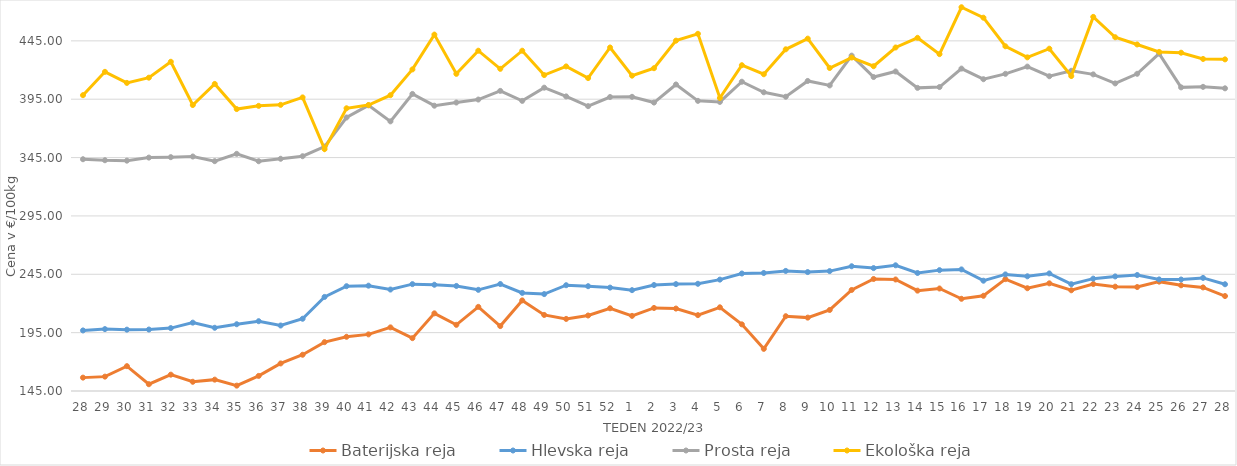
| Category | Baterijska reja | Hlevska reja | Prosta reja | Ekološka reja |
|---|---|---|---|---|
| 28.0 | 156.46 | 196.88 | 343.56 | 398.45 |
| 29.0 | 157.31 | 198.03 | 342.71 | 418.45 |
| 30.0 | 166.29 | 197.55 | 342.35 | 408.97 |
| 31.0 | 150.81 | 197.66 | 344.97 | 413.45 |
| 32.0 | 158.99 | 198.9 | 345.35 | 427.07 |
| 33.0 | 152.91 | 203.57 | 345.9 | 390 |
| 34.0 | 154.73 | 199.17 | 341.92 | 408.1 |
| 35.0 | 149.6 | 202.21 | 348.2 | 386.55 |
| 36.0 | 157.93 | 204.81 | 341.85 | 389.31 |
| 37.0 | 168.61 | 201.11 | 343.97 | 390.17 |
| 38.0 | 176.07 | 206.91 | 346.16 | 396.55 |
| 39.0 | 186.86 | 225.6 | 354.41 | 352.24 |
| 40.0 | 191.45 | 234.79 | 379.35 | 387.24 |
| 41.0 | 193.52 | 235.24 | 389.75 | 390 |
| 42.0 | 199.51 | 231.92 | 376.02 | 398.45 |
| 43.0 | 190.28 | 236.56 | 399.51 | 420.52 |
| 44.0 | 211.53 | 236.04 | 389.44 | 450.35 |
| 45.0 | 201.69 | 235.01 | 392.15 | 416.72 |
| 46.0 | 217.08 | 231.68 | 394.71 | 436.55 |
| 47.0 | 200.62 | 236.65 | 402.12 | 421.03 |
| 48.0 | 222.61 | 229.05 | 393.56 | 436.55 |
| 49.0 | 210.16 | 228.03 | 404.87 | 415.69 |
| 50.0 | 206.76 | 235.63 | 397.4 | 423.1 |
| 51.0 | 209.69 | 234.79 | 389.05 | 413.1 |
| 52.0 | 215.87 | 233.58 | 396.87 | 439.31 |
| 1.0 | 209.37 | 231.41 | 397.04 | 415.17 |
| 2.0 | 216.15 | 235.78 | 392.13 | 421.55 |
| 3.0 | 215.63 | 236.58 | 407.61 | 445.17 |
| 4.0 | 210 | 236.85 | 393.58 | 451.04 |
| 5.0 | 216.7 | 240.42 | 392.67 | 396.03 |
| 6.0 | 202.1 | 245.67 | 409.97 | 424.14 |
| 7.0 | 181.11 | 246.12 | 400.94 | 416.38 |
| 8.0 | 209.08 | 247.88 | 397.11 | 437.76 |
| 9.0 | 207.87 | 246.89 | 410.64 | 446.9 |
| 10.0 | 214.42 | 247.73 | 406.8 | 421.72 |
| 11.0 | 231.56 | 251.88 | 432.34 | 430.69 |
| 12.0 | 240.97 | 250.3 | 414 | 423.28 |
| 13.0 | 240.55 | 252.7 | 418.74 | 439.31 |
| 14.0 | 230.99 | 246.12 | 404.72 | 447.59 |
| 15.0 | 232.82 | 248.56 | 405.42 | 433.62 |
| 16.0 | 224 | 249.17 | 421.22 | 473.79 |
| 17.0 | 226.57 | 239.5 | 412.13 | 464.83 |
| 18.0 | 240.83 | 244.89 | 416.74 | 440.35 |
| 19.0 | 233.05 | 243.26 | 422.93 | 430.86 |
| 20.0 | 237.25 | 245.73 | 414.68 | 438.28 |
| 21.0 | 231.3 | 236.5 | 419.36 | 414.83 |
| 22.0 | 236.67 | 241.27 | 416.27 | 465.52 |
| 23.0 | 234.39 | 243.16 | 408.53 | 448.1 |
| 24.0 | 234.08 | 244.37 | 416.78 | 441.9 |
| 25.0 | 238.69 | 240.6 | 434.05 | 435.52 |
| 26.0 | 235.57 | 240.51 | 405.15 | 434.83 |
| 27.0 | 233.75 | 241.89 | 405.58 | 429.48 |
| 28.0 | 226.35 | 236.46 | 404.32 | 429.14 |